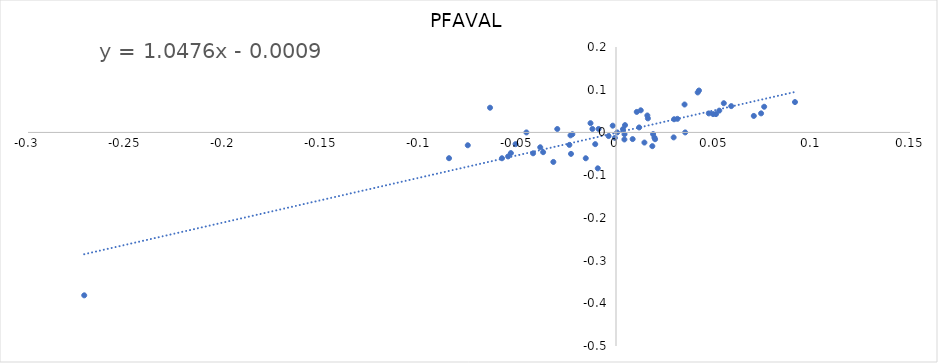
| Category | PFAVAL |
|---|---|
| 0.07031166163327263 | 0.039 |
| -0.064260393167902 | 0.058 |
| 0.018926696361604822 | -0.004 |
| -0.010598264919067013 | -0.027 |
| -0.053634872916097365 | -0.048 |
| -0.0222767710313736 | -0.004 |
| -0.0005661213304670731 | -0.013 |
| -0.0851879520248251 | -0.06 |
| 0.03531174844753959 | 0 |
| 0.018531520052699424 | -0.032 |
| 0.05878698652869163 | 0.062 |
| 0.07402525378364677 | 0.045 |
| 0.004602363294843093 | 0.017 |
| -0.03717912426811287 | -0.046 |
| 0.015992139325808008 | 0.04 |
| -0.0037770907263284803 | -0.008 |
| 0.05500603873966159 | 0.068 |
| -0.029959860308075847 | 0.008 |
| 0.01994278586527054 | -0.016 |
| -0.05818986034726448 | -0.06 |
| 0.051015885604982714 | 0.043 |
| 0.0042835582386362425 | -0.016 |
| -0.022954466765379822 | -0.05 |
| 0.029631081722975683 | 0.031 |
| 0.004342381792751926 | -0.004 |
| 0.04953555856919967 | 0.043 |
| 0.01626976408147396 | 0.033 |
| 0.012625606671679446 | 0.052 |
| 0.0006075457178154053 | 0 |
| 0.003541864842437681 | 0.008 |
| -0.04231203614069057 | -0.049 |
| 0.014495500428196362 | -0.024 |
| 0.047341945572677124 | 0.045 |
| 0.029418954183595858 | -0.012 |
| -0.05124568406730934 | -0.027 |
| -0.015429572558224414 | -0.06 |
| 0.0756018467626689 | 0.06 |
| -0.012040420041390831 | 0.008 |
| 0.01958996838450644 | -0.012 |
| -0.03196555506940357 | -0.069 |
| 0.010592165596750913 | 0.048 |
| -0.023788380640017648 | -0.029 |
| -0.07562065508243299 | -0.03 |
| -0.009294775100920916 | -0.084 |
| -0.03865172123778304 | -0.035 |
| 0.09131703785267686 | 0.071 |
| 0.04233557473687122 | 0.098 |
| 0.052689505194693176 | 0.051 |
| -0.00888054719286524 | 0.008 |
| -0.05505706514831865 | -0.056 |
| 0.041681237390719605 | 0.094 |
| 0.008489457578535697 | -0.016 |
| -0.0016707956444086403 | 0.016 |
| 0.011824151020827012 | 0.012 |
| 0.03497553803645226 | 0.065 |
| -0.01299941830205431 | 0.022 |
| 0.0313290982182739 | 0.032 |
| -0.02321314709880784 | -0.007 |
| -0.04570675501745869 | 0 |
| -0.27131342724943686 | -0.381 |